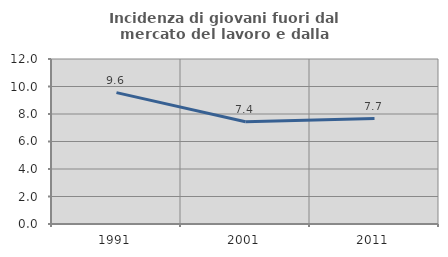
| Category | Incidenza di giovani fuori dal mercato del lavoro e dalla formazione  |
|---|---|
| 1991.0 | 9.556 |
| 2001.0 | 7.439 |
| 2011.0 | 7.668 |